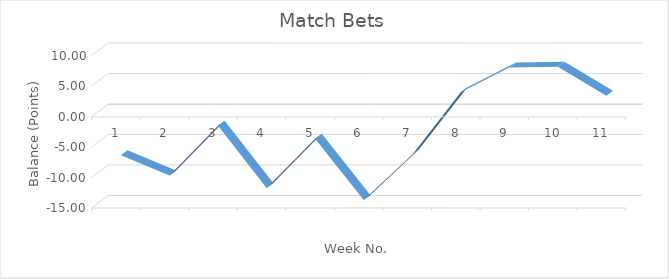
| Category | Running Total |
|---|---|
| 0 | -7.06 |
| 1 | -10.36 |
| 2 | -2.2 |
| 3 | -12.43 |
| 4 | -4.32 |
| 5 | -14.4 |
| 6 | -6.94 |
| 7 | 3.29 |
| 8 | 7.36 |
| 9 | 7.46 |
| 10 | 2.73 |